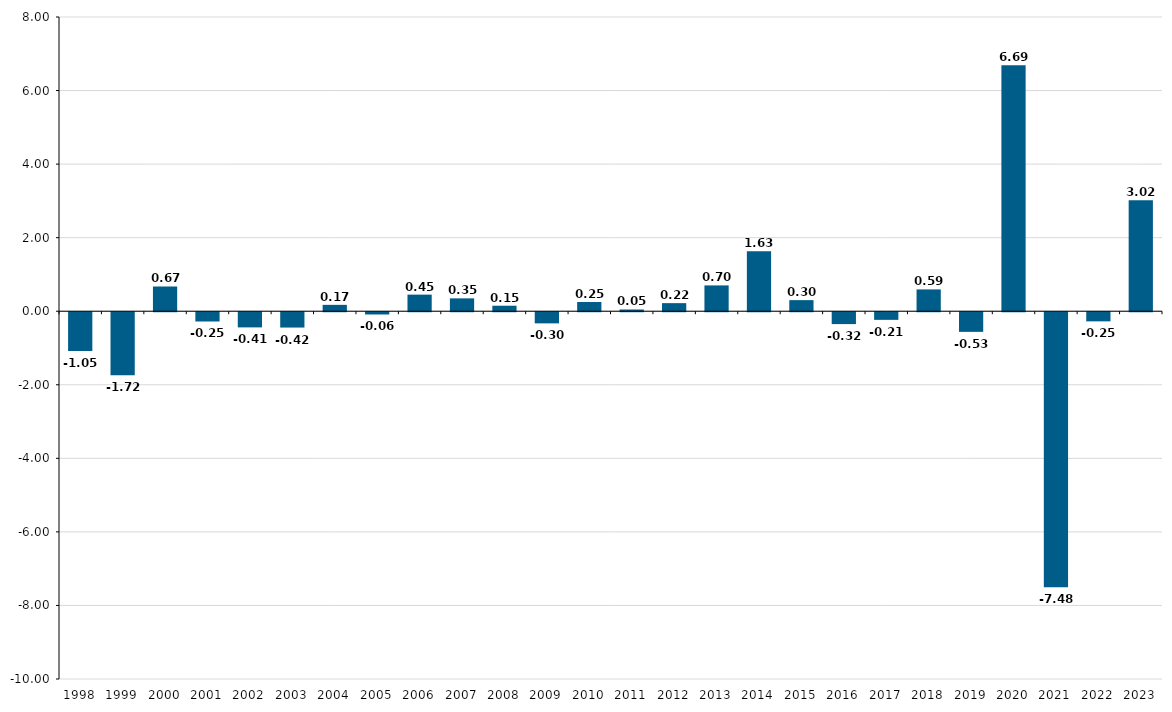
| Category | Impulso Fiscal Ajustado |
|---|---|
| 1998.0 | -1.054 |
| 1999.0 | -1.716 |
| 2000.0 | 0.672 |
| 2001.0 | -0.252 |
| 2002.0 | -0.413 |
| 2003.0 | -0.417 |
| 2004.0 | 0.173 |
| 2005.0 | -0.061 |
| 2006.0 | 0.451 |
| 2007.0 | 0.35 |
| 2008.0 | 0.15 |
| 2009.0 | -0.303 |
| 2010.0 | 0.251 |
| 2011.0 | 0.047 |
| 2012.0 | 0.22 |
| 2013.0 | 0.702 |
| 2014.0 | 1.628 |
| 2015.0 | 0.302 |
| 2016.0 | -0.323 |
| 2017.0 | -0.208 |
| 2018.0 | 0.593 |
| 2019.0 | -0.534 |
| 2020.0 | 6.688 |
| 2021.0 | -7.478 |
| 2022.0 | -0.249 |
| 2023.0 | 3.02 |